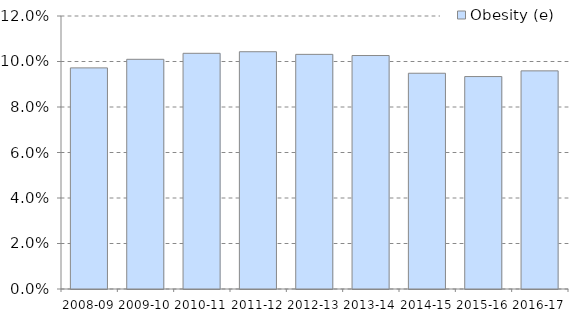
| Category | Obesity (e) |
|---|---|
| 2008-09 | 0.097 |
| 2009-10 | 0.101 |
| 2010-11 | 0.104 |
| 2011-12 | 0.104 |
| 2012-13 | 0.103 |
| 2013-14 | 0.103 |
| 2014-15 | 0.095 |
| 2015-16 | 0.093 |
| 2016-17 | 0.096 |